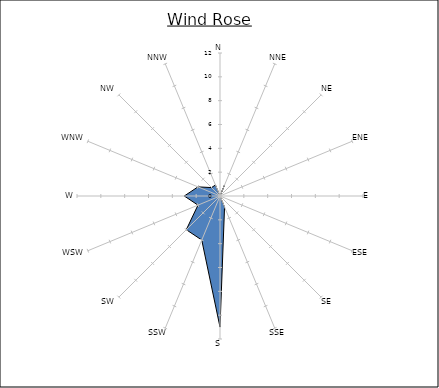
| Category | Series 0 |
|---|---|
| N | 0 |
| NNE | 1 |
| NE | 0 |
| ENE | 0 |
| E | 0 |
| ESE | 0 |
| SE | 0 |
| SSE | 1 |
| S | 11 |
| SSW | 4 |
| SW | 4 |
| WSW | 2 |
| W | 3 |
| WNW | 2 |
| NW | 1 |
| NNW | 1 |